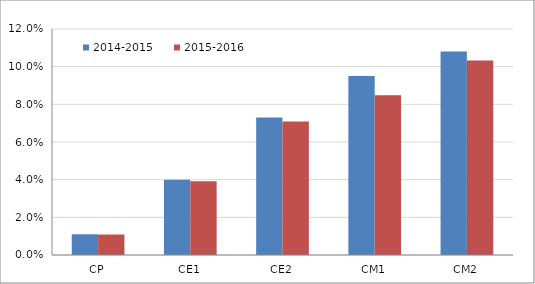
| Category | 2014-2015 | 2015-2016 |
|---|---|---|
| CP | 0.011 | 0.011 |
| CE1 | 0.04 | 0.039 |
| CE2 | 0.073 | 0.071 |
| CM1 | 0.095 | 0.085 |
| CM2 | 0.108 | 0.103 |